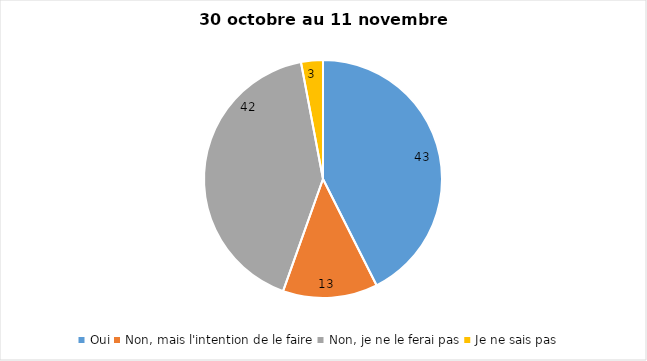
| Category | Series 0 |
|---|---|
| Oui | 43 |
| Non, mais l'intention de le faire | 13 |
| Non, je ne le ferai pas | 42 |
| Je ne sais pas | 3 |